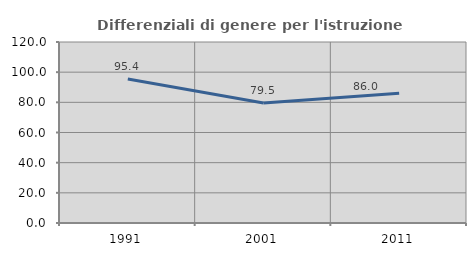
| Category | Differenziali di genere per l'istruzione superiore |
|---|---|
| 1991.0 | 95.436 |
| 2001.0 | 79.524 |
| 2011.0 | 85.958 |